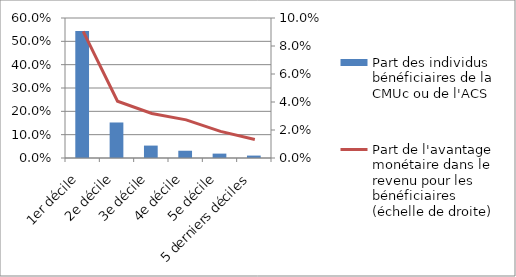
| Category | Part des individus bénéficiaires de la CMUc ou de l'ACS |
|---|---|
| 1er décile | 0.544 |
| 2e décile | 0.152 |
| 3e décile | 0.053 |
| 4e décile | 0.031 |
| 5e décile | 0.019 |
| 5 derniers déciles | 0.01 |